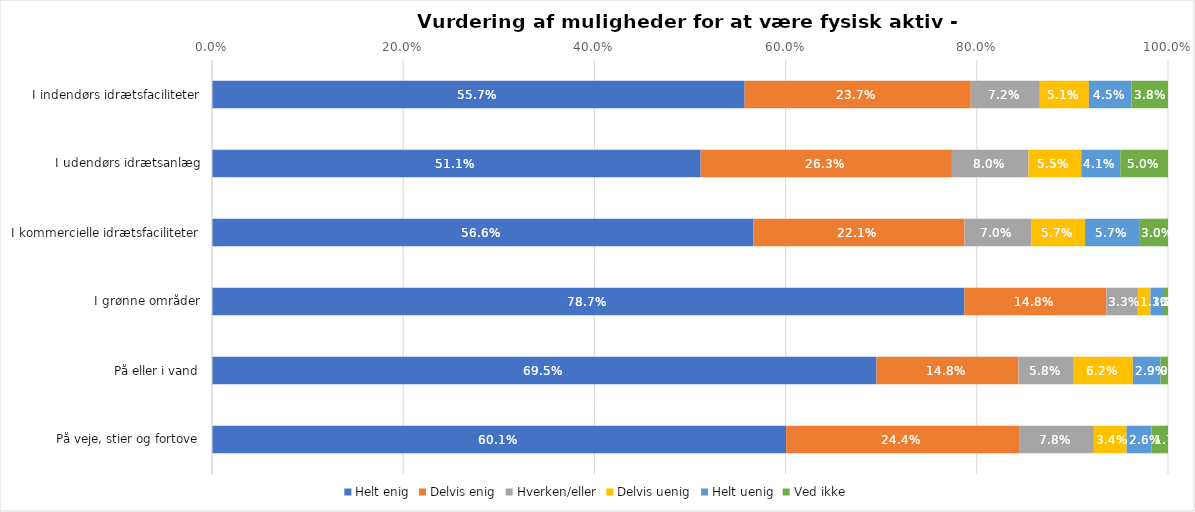
| Category | Helt enig | Delvis enig | Hverken/eller | Delvis uenig | Helt uenig | Ved ikke |
|---|---|---|---|---|---|---|
| I indendørs idrætsfaciliteter | 0.557 | 0.237 | 0.072 | 0.051 | 0.045 | 0.038 |
| I udendørs idrætsanlæg | 0.511 | 0.263 | 0.08 | 0.055 | 0.041 | 0.05 |
| I kommercielle idrætsfaciliteter | 0.566 | 0.221 | 0.07 | 0.057 | 0.057 | 0.03 |
| I grønne områder | 0.787 | 0.148 | 0.033 | 0.013 | 0.013 | 0.005 |
| På eller i vand | 0.695 | 0.148 | 0.058 | 0.062 | 0.029 | 0.008 |
| På veje, stier og fortove | 0.601 | 0.244 | 0.078 | 0.034 | 0.026 | 0.017 |